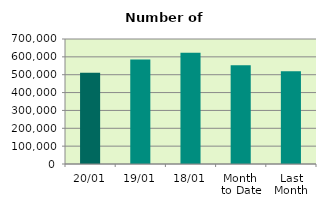
| Category | Series 0 |
|---|---|
| 20/01 | 511382 |
| 19/01 | 585384 |
| 18/01 | 622572 |
| Month 
to Date | 553561.733 |
| Last
Month | 519611.714 |